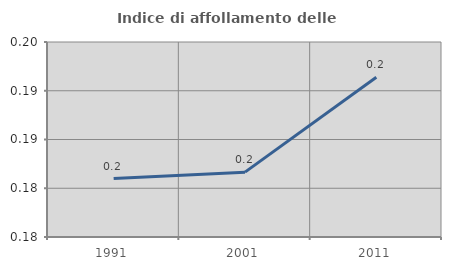
| Category | Indice di affollamento delle abitazioni  |
|---|---|
| 1991.0 | 0.181 |
| 2001.0 | 0.182 |
| 2011.0 | 0.191 |